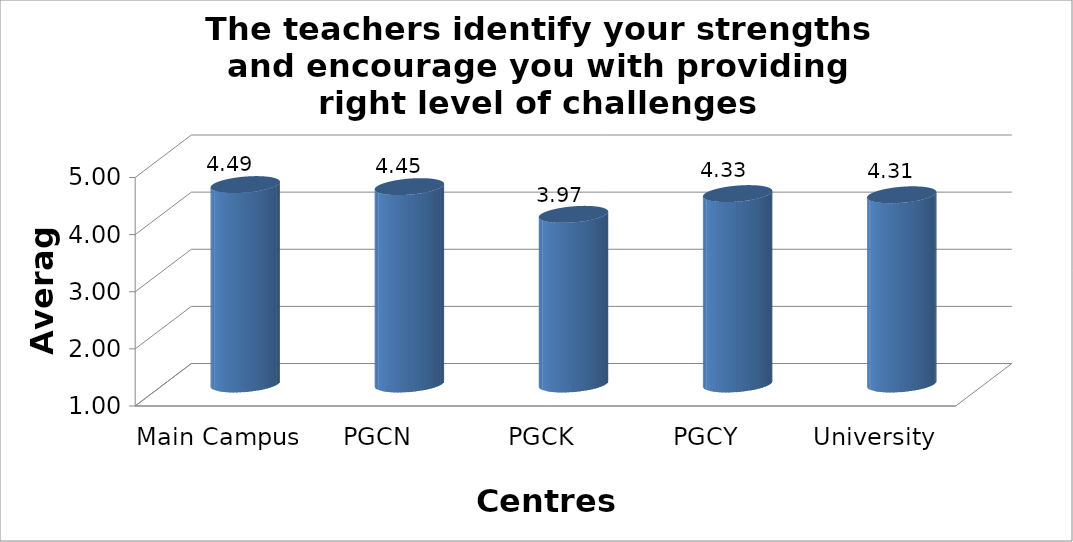
| Category | The teachers identify your strengths and encourage you with providing right level of challenges |
|---|---|
| Main Campus | 4.49 |
| PGCN | 4.455 |
| PGCK | 3.969 |
| PGCY | 4.333 |
| University Avg | 4.312 |